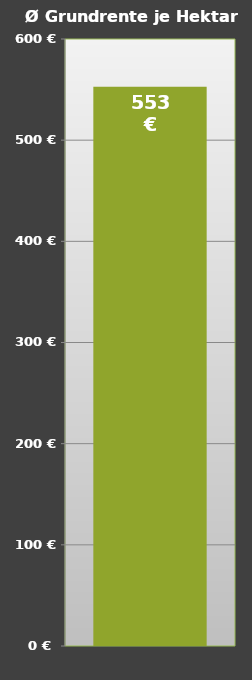
| Category | 553 € |
|---|---|
| 0 | 552.7 |